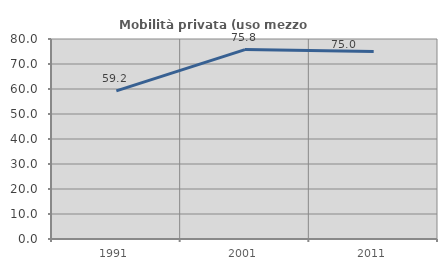
| Category | Mobilità privata (uso mezzo privato) |
|---|---|
| 1991.0 | 59.245 |
| 2001.0 | 75.758 |
| 2011.0 | 74.965 |